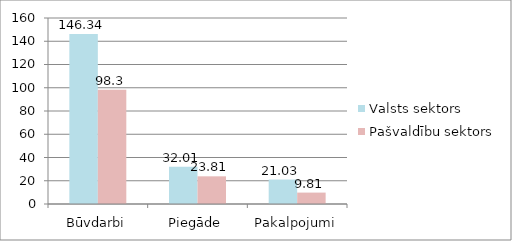
| Category | Valsts sektors | Pašvaldību sektors |
|---|---|---|
| Būvdarbi | 146.34 | 98.3 |
| Piegāde | 32.01 | 23.81 |
| Pakalpojumi | 21.03 | 9.81 |